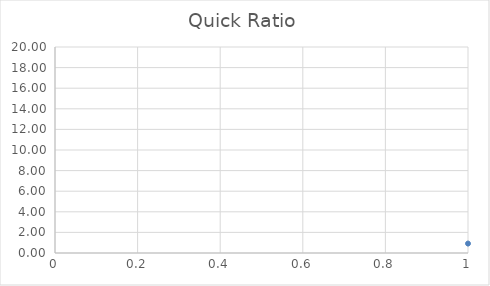
| Category | Series 0 |
|---|---|
| 0 | 0.917 |
| 1 | 0.999 |
| 2 | 1.084 |
| 3 | 1.106 |
| 4 | 1.135 |
| 5 | 1.193 |
| 6 | 1.301 |
| 7 | 1.463 |
| 8 | 1.51 |
| 9 | 1.523 |
| 10 | 1.536 |
| 11 | 1.596 |
| 12 | 1.598 |
| 13 | 1.725 |
| 14 | 1.735 |
| 15 | 1.759 |
| 16 | 1.842 |
| 17 | 1.93 |
| 18 | 1.954 |
| 19 | 2.008 |
| 20 | 2.049 |
| 21 | 2.06 |
| 22 | 2.225 |
| 23 | 2.363 |
| 24 | 2.439 |
| 25 | 2.459 |
| 26 | 2.481 |
| 27 | 2.532 |
| 28 | 2.551 |
| 29 | 2.552 |
| 30 | 2.559 |
| 31 | 2.655 |
| 32 | 2.766 |
| 33 | 2.99 |
| 34 | 3.132 |
| 35 | 3.249 |
| 36 | 3.651 |
| 37 | 3.684 |
| 38 | 3.858 |
| 39 | 3.863 |
| 40 | 4.048 |
| 41 | 4.117 |
| 42 | 4.227 |
| 43 | 4.36 |
| 44 | 4.591 |
| 45 | 4.821 |
| 46 | 5.795 |
| 47 | 6.63 |
| 48 | 7.593 |
| 49 | 17.377 |